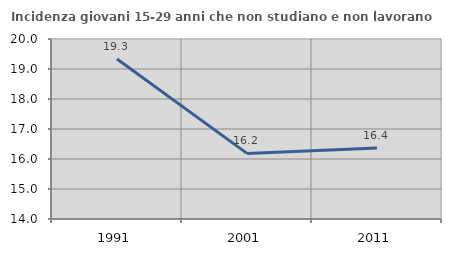
| Category | Incidenza giovani 15-29 anni che non studiano e non lavorano  |
|---|---|
| 1991.0 | 19.333 |
| 2001.0 | 16.187 |
| 2011.0 | 16.37 |